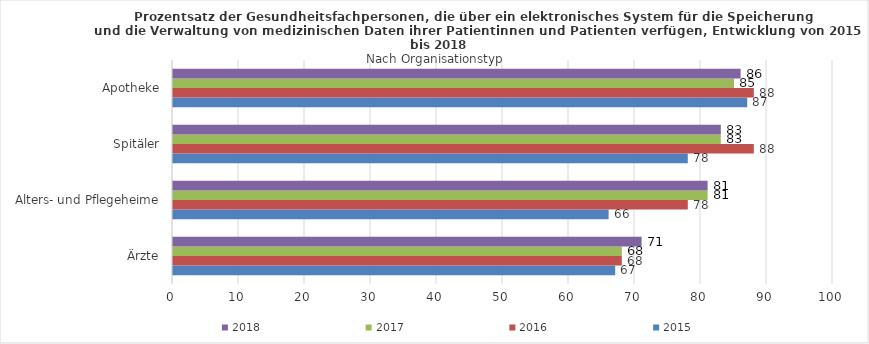
| Category | 2015 | 2016 | 2017 | 2018 |
|---|---|---|---|---|
| Ärzte | 67 | 68 | 68 | 71 |
| Alters- und Pflegeheime | 66 | 78 | 81 | 81 |
| Spitäler | 78 | 88 | 83 | 83 |
| Apotheke | 87 | 88 | 85 | 86 |